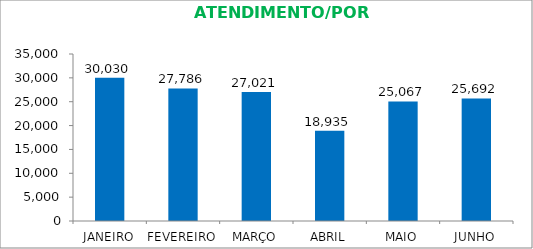
| Category | Series 0 |
|---|---|
| JANEIRO | 30030 |
| FEVEREIRO | 27786 |
| MARÇO | 27021 |
| ABRIL | 18935 |
| MAIO | 25067 |
| JUNHO | 25692 |